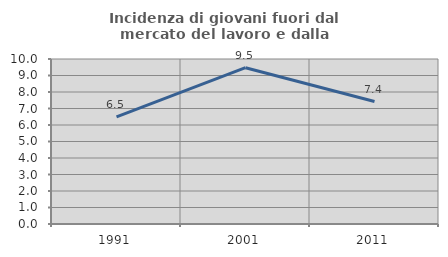
| Category | Incidenza di giovani fuori dal mercato del lavoro e dalla formazione  |
|---|---|
| 1991.0 | 6.497 |
| 2001.0 | 9.471 |
| 2011.0 | 7.422 |